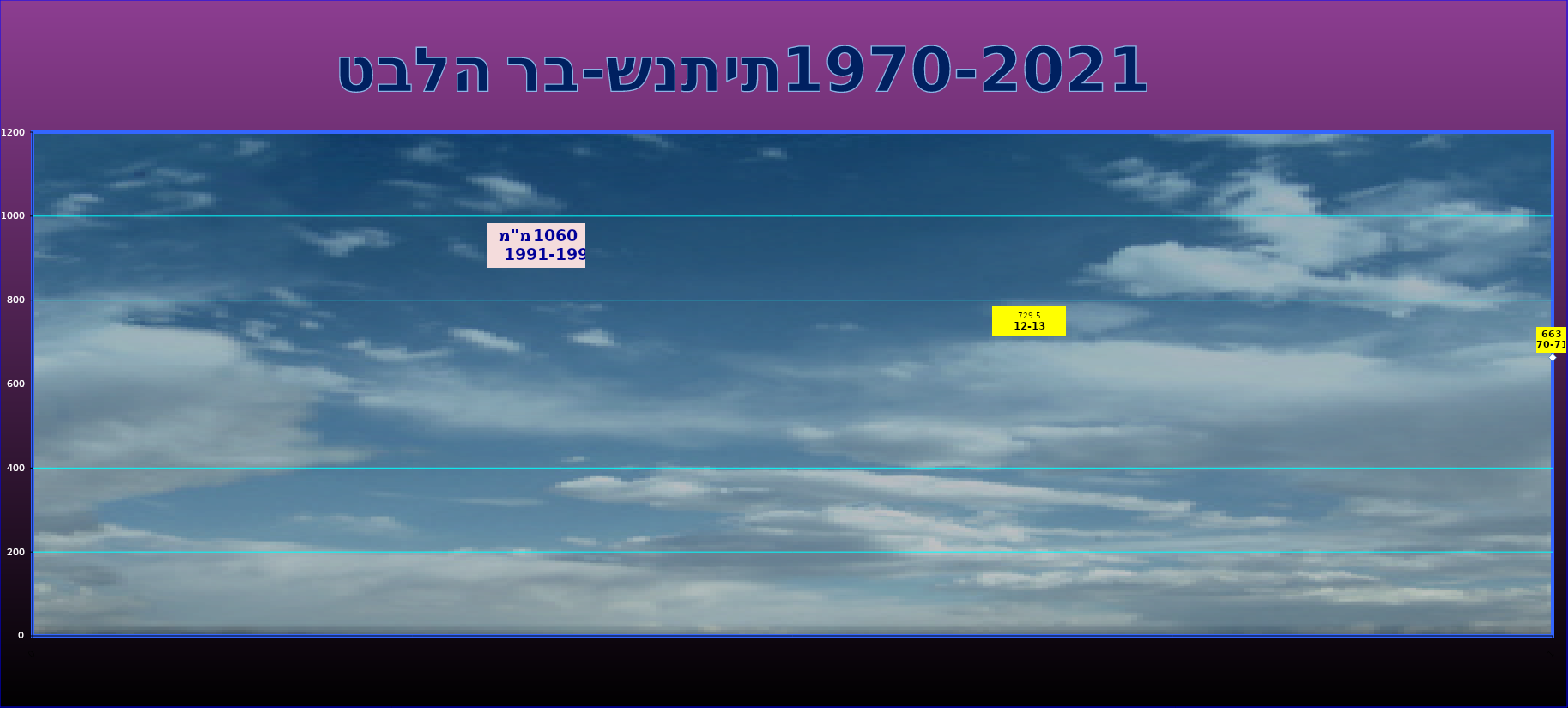
| Category | Series 0 |
|---|---|
| 0 | 663 |
| 1 | 649 |
| 2 | 409 |
| 3 | 637 |
| 4 | 548 |
| 5 | 528 |
| 6 | 690 |
| 7 | 596 |
| 8 | 366 |
| 9 | 791 |
| 10 | 600 |
| 11 | 401 |
| 12 | 663 |
| 13 | 483 |
| 14 | 481 |
| 15 | 633 |
| 16 | 682 |
| 17 | 438 |
| 18 | 612 |
| 19 | 421 |
| 20 | 1060 |
| 21 | 569 |
| 22 | 376.3 |
| 23 | 675.5 |
| 24 | 506.2 |
| 25 | 578.6 |
| 26 | 642.5 |
| 27 | 367 |
| 28 | 513.4 |
| 29 | 450.7 |
| 30 | 637.5 |
| 31 | 779 |
| 32 | 571.5 |
| 33 | 501.5 |
| 34 | 510.5 |
| 35 | 506 |
| 36 | 415.5 |
| 37 | 600 |
| 38 | 566.5 |
| 39 | 562 |
| 40 | 565 |
| 41 | 729.5 |
| 42 | 373.5 |
| 43 | 696 |
| 44 | 472 |
| 45 | 498 |
| 46 | 623 |
| 47 | 796.5 |
| 48 | 810 |
| 49 | 674 |
| 50 | 478 |